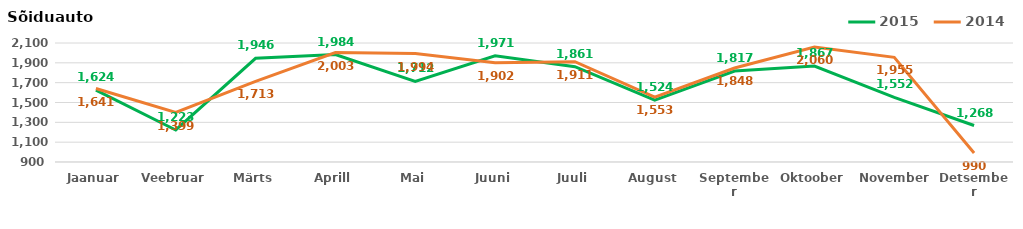
| Category | 2015 | 2014 |
|---|---|---|
| Jaanuar | 1624 | 1641 |
| Veebruar | 1223 | 1399 |
| Märts | 1946 | 1713 |
| Aprill | 1984 | 2003 |
| Mai | 1712 | 1994 |
| Juuni | 1971 | 1902 |
| Juuli | 1861 | 1911 |
| August | 1524 | 1553 |
| September | 1817 | 1848 |
| Oktoober | 1867 | 2060 |
| November | 1552 | 1955 |
| Detsember | 1268 | 990 |